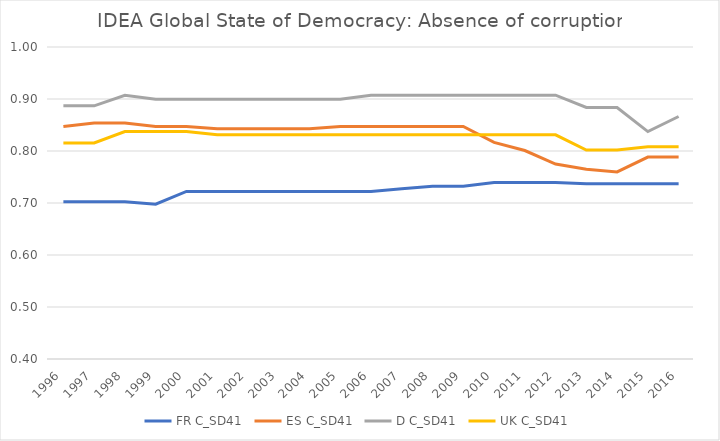
| Category | FR | ES | D | UK |
|---|---|---|---|---|
| 1996.0 | 0.703 | 0.847 | 0.887 | 0.815 |
| 1997.0 | 0.703 | 0.854 | 0.887 | 0.815 |
| 1998.0 | 0.703 | 0.854 | 0.907 | 0.837 |
| 1999.0 | 0.698 | 0.847 | 0.899 | 0.837 |
| 2000.0 | 0.722 | 0.847 | 0.899 | 0.837 |
| 2001.0 | 0.722 | 0.843 | 0.899 | 0.831 |
| 2002.0 | 0.722 | 0.843 | 0.899 | 0.831 |
| 2003.0 | 0.722 | 0.843 | 0.899 | 0.831 |
| 2004.0 | 0.722 | 0.843 | 0.899 | 0.831 |
| 2005.0 | 0.722 | 0.847 | 0.899 | 0.831 |
| 2006.0 | 0.722 | 0.847 | 0.907 | 0.831 |
| 2007.0 | 0.727 | 0.847 | 0.907 | 0.831 |
| 2008.0 | 0.732 | 0.847 | 0.907 | 0.831 |
| 2009.0 | 0.732 | 0.847 | 0.907 | 0.831 |
| 2010.0 | 0.74 | 0.817 | 0.907 | 0.831 |
| 2011.0 | 0.74 | 0.801 | 0.907 | 0.831 |
| 2012.0 | 0.74 | 0.775 | 0.907 | 0.831 |
| 2013.0 | 0.737 | 0.765 | 0.884 | 0.802 |
| 2014.0 | 0.737 | 0.76 | 0.884 | 0.802 |
| 2015.0 | 0.737 | 0.788 | 0.837 | 0.808 |
| 2016.0 | 0.737 | 0.788 | 0.866 | 0.808 |